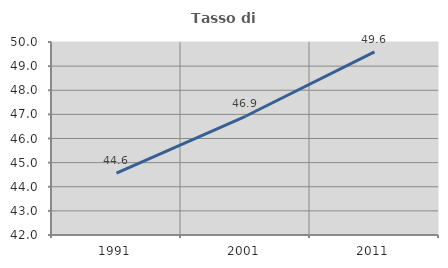
| Category | Tasso di occupazione   |
|---|---|
| 1991.0 | 44.563 |
| 2001.0 | 46.922 |
| 2011.0 | 49.591 |